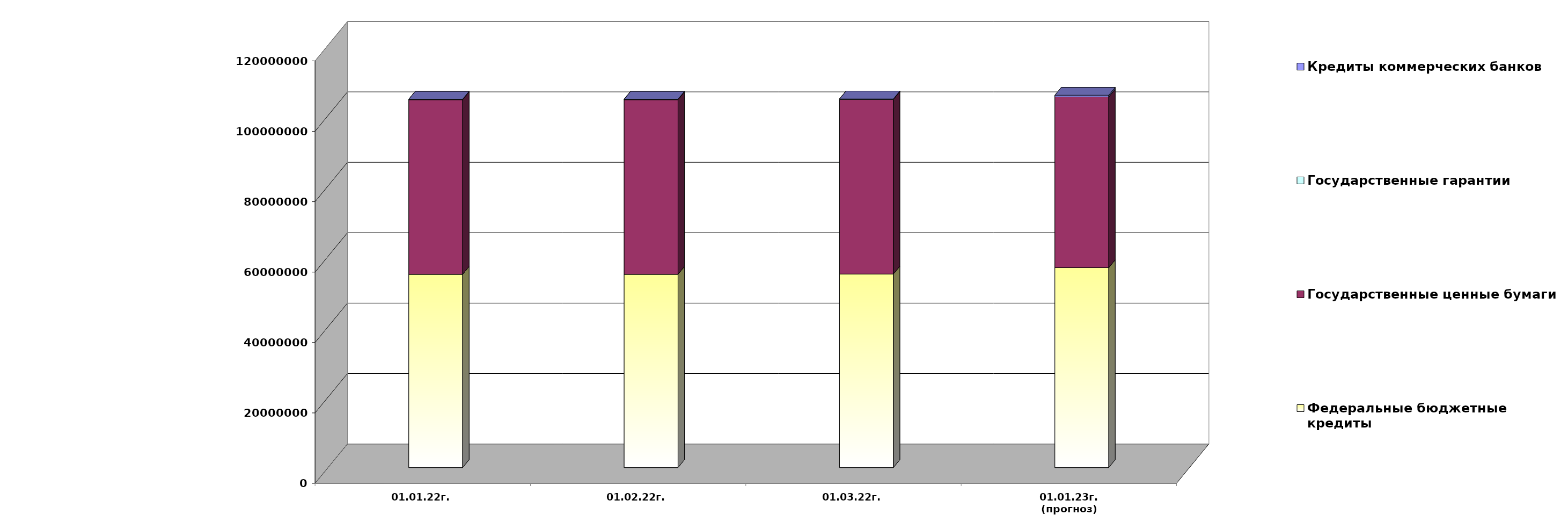
| Category | Федеральные бюджетные кредиты | Государственные ценные бумаги  | Государственные гарантии | Кредиты коммерческих банков |
|---|---|---|---|---|
| 01.01.22г. | 54900618.713 | 49600000 | 141570.67 | 0 |
| 01.02.22г. | 54900618.713 | 49600000 | 139748.87 | 0 |
| 01.03.22г. | 54970753.113 | 49600000 | 139748.87 | 0 |
| 01.01.23г.
(прогноз) | 56784668.3 | 48500000 | 0 | 486329.5 |